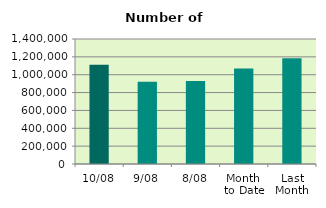
| Category | Series 0 |
|---|---|
| 10/08 | 1111262 |
| 9/08 | 921896 |
| 8/08 | 928676 |
| Month 
to Date | 1070641 |
| Last
Month | 1183989.81 |